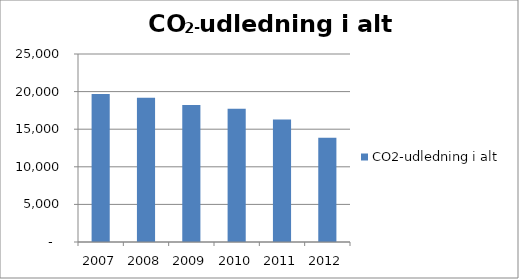
| Category | CO2-udledning i alt |
|---|---|
| 2007.0 | 19680.13 |
| 2008.0 | 19188.543 |
| 2009.0 | 18205.899 |
| 2010.0 | 17728.955 |
| 2011.0 | 16283.756 |
| 2012.0 | 13853.533 |